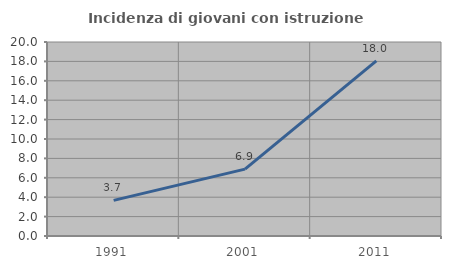
| Category | Incidenza di giovani con istruzione universitaria |
|---|---|
| 1991.0 | 3.67 |
| 2001.0 | 6.897 |
| 2011.0 | 18.049 |